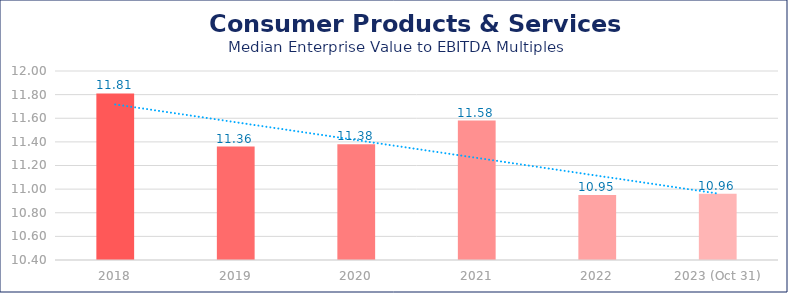
| Category | Consumer Products & Services |
|---|---|
| 2018 | 11.81 |
| 2019 | 11.36 |
| 2020 | 11.38 |
| 2021 | 11.58 |
| 2022 | 10.95 |
| 2023 (Oct 31) | 10.96 |